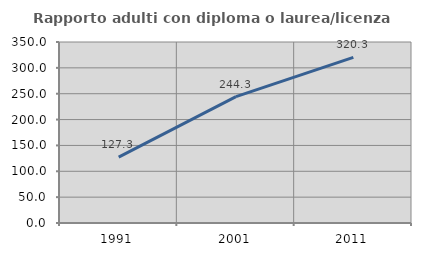
| Category | Rapporto adulti con diploma o laurea/licenza media  |
|---|---|
| 1991.0 | 127.314 |
| 2001.0 | 244.258 |
| 2011.0 | 320.341 |